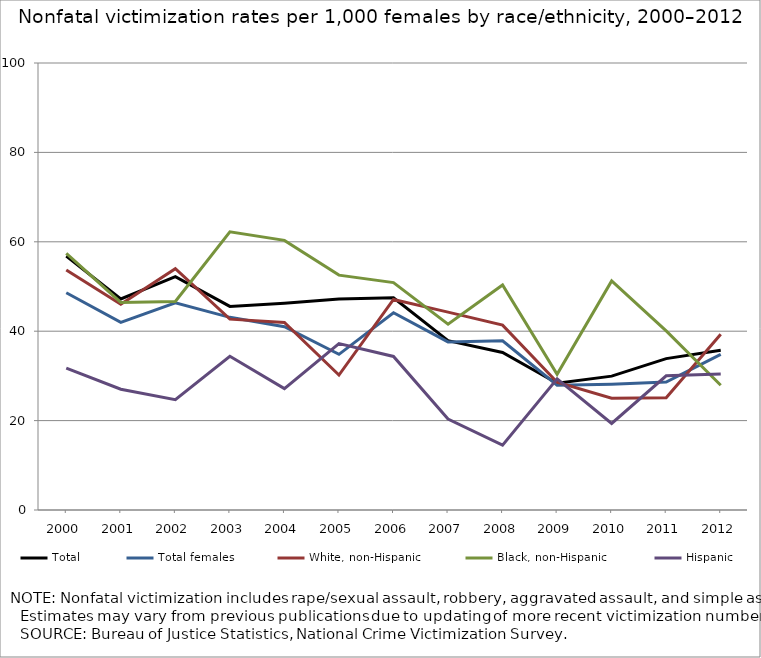
| Category | Total  | Total females | White, non-Hispanic | Black, non-Hispanic  | Hispanic |
|---|---|---|---|---|---|
| 2000.0 | 56.786 | 48.59 | 53.698 | 57.419 | 31.744 |
| 2001.0 | 47.203 | 41.991 | 46.022 | 46.443 | 27.01 |
| 2002.0 | 52.188 | 46.363 | 53.968 | 46.667 | 24.671 |
| 2003.0 | 45.554 | 43.102 | 42.698 | 62.223 | 34.383 |
| 2004.0 | 46.252 | 40.988 | 41.959 | 60.321 | 27.16 |
| 2005.0 | 47.193 | 34.826 | 30.183 | 52.547 | 37.236 |
| 2006.0 | 47.468 | 44.142 | 47.104 | 50.878 | 34.355 |
| 2007.0 | 37.895 | 37.599 | 44.272 | 41.575 | 20.344 |
| 2008.0 | 35.238 | 37.848 | 41.359 | 50.35 | 14.514 |
| 2009.0 | 28.359 | 27.907 | 28.574 | 30.344 | 29.362 |
| 2010.0 | 29.946 | 28.154 | 25.01 | 51.242 | 19.366 |
| 2011.0 | 33.864 | 28.628 | 25.121 | 40.065 | 30.018 |
| 2012.0 | 35.738 | 34.813 | 39.339 | 27.908 | 30.417 |